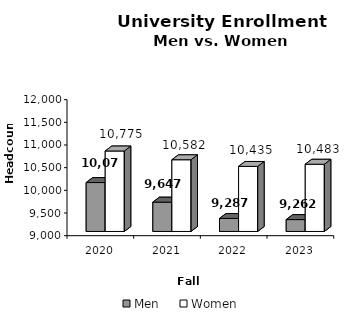
| Category | Men | Women |
|---|---|---|
| 2020.0 | 10079 | 10775 |
| 2021.0 | 9647 | 10582 |
| 2022.0 | 9287 | 10435 |
| 2023.0 | 9262 | 10483 |